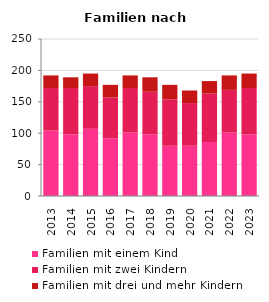
| Category | Familien mit einem Kind | Familien mit zwei Kindern | Familien mit drei und mehr Kindern |
|---|---|---|---|
| 2013.0 | 104 | 68 | 20 |
| 2014.0 | 98 | 74 | 17 |
| 2015.0 | 107 | 68 | 20 |
| 2016.0 | 92 | 65 | 20 |
| 2017.0 | 101 | 71 | 20 |
| 2018.0 | 98 | 68 | 23 |
| 2019.0 | 80 | 74 | 23 |
| 2020.0 | 80 | 68 | 20 |
| 2021.0 | 86 | 77 | 20 |
| 2022.0 | 101 | 68 | 23 |
| 2023.0 | 98 | 74 | 23 |